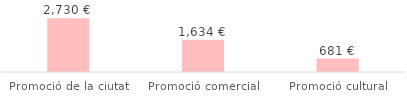
| Category | Total |
|---|---|
| Promoció de la ciutat | 2729.76 |
| Promoció comercial | 1633.5 |
| Promoció cultural | 680.63 |